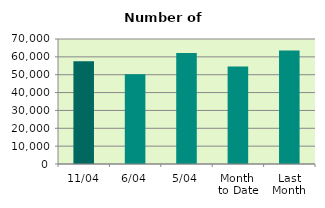
| Category | Series 0 |
|---|---|
| 11/04 | 57488 |
| 6/04 | 50254 |
| 5/04 | 62098 |
| Month 
to Date | 54634.8 |
| Last
Month | 63497.391 |